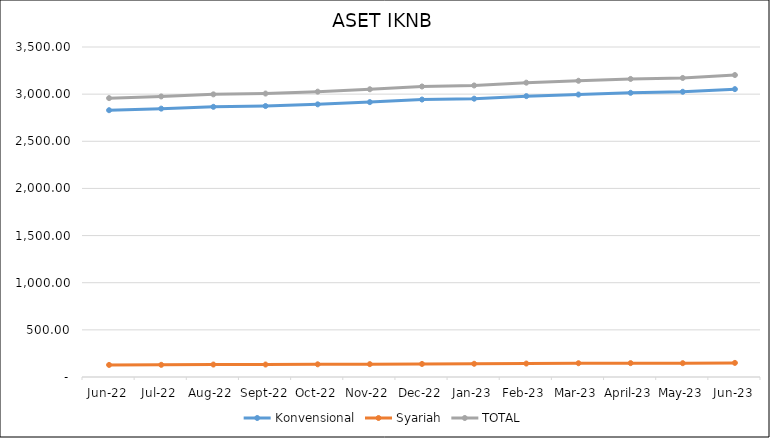
| Category |  Konvensional  |  Syariah  | TOTAL |
|---|---|---|---|
| Jun-22 | 2829.665 | 128.036 | 2957.702 |
| Jul-22 | 2846.372 | 129.148 | 2975.52 |
| Aug-22 | 2865.619 | 132.075 | 2997.694 |
| Sep-22 | 2873.938 | 132.351 | 3006.289 |
| Oct-22 | 2891.826 | 134.628 | 3026.454 |
| Nov-22 | 2915.393 | 136.376 | 3051.769 |
| Dec-22 | 2942.716 | 138.533 | 3081.249 |
| Jan-23 | 2951.832 | 140.165 | 3091.997 |
| Feb-23 | 2978.913 | 142.696 | 3121.609 |
| Mar-23 | 2995.706 | 146.066 | 3141.772 |
| April-23 | 3013.962 | 147.013 | 3160.975 |
| May-23 | 3025.142 | 146.46 | 3171.602 |
| Jun-23 | 3053.172 | 149.576 | 3202.747 |